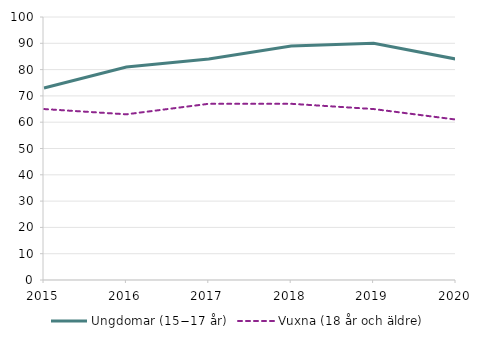
| Category | Ungdomar (15−17 år)  | Vuxna (18 år och äldre)  |
|---|---|---|
| 2015 | 73 | 65 |
| 2016 | 81 | 63 |
| 2017 | 84 | 67 |
| 2018 | 89 | 67 |
| 2019 | 90 | 65 |
| 2020 | 84 | 61 |